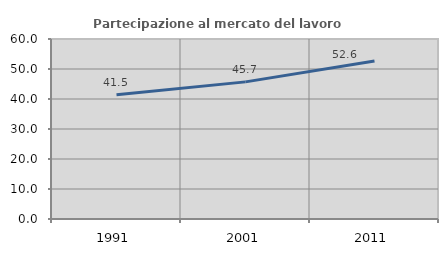
| Category | Partecipazione al mercato del lavoro  femminile |
|---|---|
| 1991.0 | 41.452 |
| 2001.0 | 45.709 |
| 2011.0 | 52.637 |